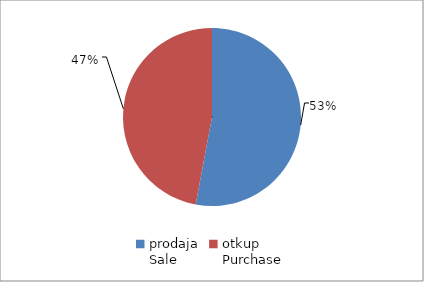
| Category | Series 0 |
|---|---|
| prodaja
Sale | 12849708.75 |
| otkup
Purchase | 11423637.5 |